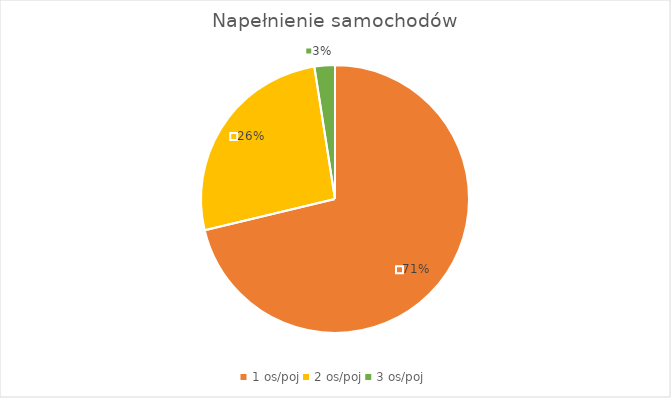
| Category | Series 0 |
|---|---|
| 1 os/poj | 491 |
| 2 os/poj | 181 |
| 3 os/poj | 17 |